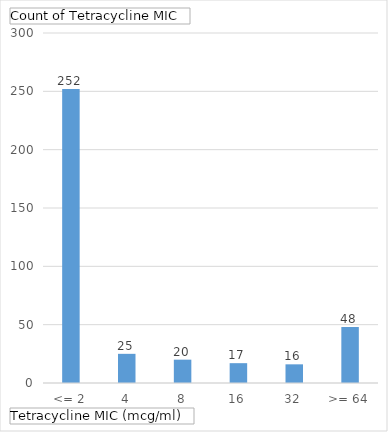
| Category | Total |
|---|---|
| <= 2 | 252 |
| 4 | 25 |
| 8 | 20 |
| 16 | 17 |
| 32 | 16 |
| >= 64 | 48 |